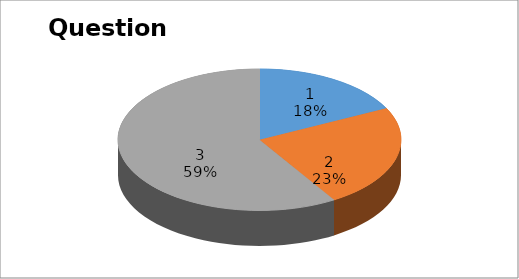
| Category | Series 0 |
|---|---|
| 0 | 3 |
| 1 | 4 |
| 2 | 10 |